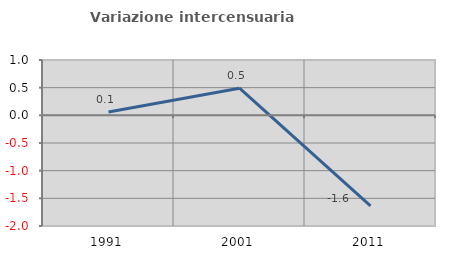
| Category | Variazione intercensuaria annua |
|---|---|
| 1991.0 | 0.058 |
| 2001.0 | 0.49 |
| 2011.0 | -1.636 |